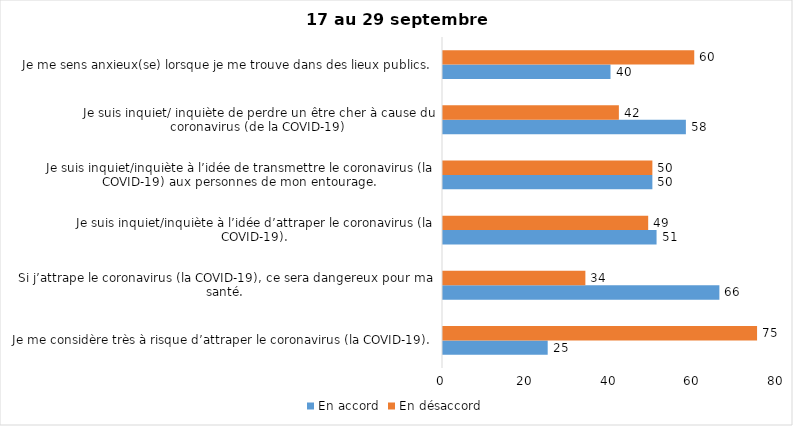
| Category | En accord | En désaccord |
|---|---|---|
| Je me considère très à risque d’attraper le coronavirus (la COVID-19). | 25 | 75 |
| Si j’attrape le coronavirus (la COVID-19), ce sera dangereux pour ma santé. | 66 | 34 |
| Je suis inquiet/inquiète à l’idée d’attraper le coronavirus (la COVID-19). | 51 | 49 |
| Je suis inquiet/inquiète à l’idée de transmettre le coronavirus (la COVID-19) aux personnes de mon entourage. | 50 | 50 |
| Je suis inquiet/ inquiète de perdre un être cher à cause du coronavirus (de la COVID-19) | 58 | 42 |
| Je me sens anxieux(se) lorsque je me trouve dans des lieux publics. | 40 | 60 |